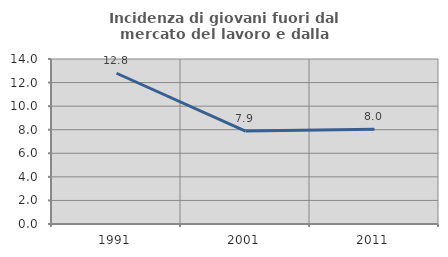
| Category | Incidenza di giovani fuori dal mercato del lavoro e dalla formazione  |
|---|---|
| 1991.0 | 12.791 |
| 2001.0 | 7.882 |
| 2011.0 | 8.029 |